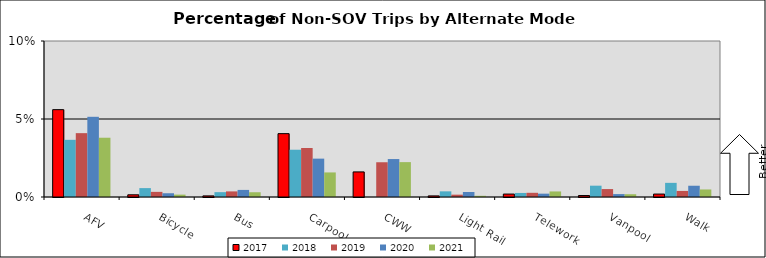
| Category | 2017 | 2018 | 2019 | 2020 | 2021 |
|---|---|---|---|---|---|
| AFV | 0.056 | 0.037 | 0.041 | 0.051 | 0.038 |
| Bicycle | 0.001 | 0.006 | 0.003 | 0.002 | 0.002 |
| Bus | 0.001 | 0.003 | 0.004 | 0.005 | 0.003 |
| Carpool | 0.041 | 0.03 | 0.031 | 0.025 | 0.016 |
| CWW | 0.016 | 0 | 0.022 | 0.024 | 0.022 |
| Light Rail | 0.001 | 0.004 | 0.001 | 0.003 | 0.001 |
| Telework | 0.002 | 0.003 | 0.003 | 0.002 | 0.004 |
| Vanpool | 0.001 | 0.007 | 0.005 | 0.002 | 0.002 |
| Walk | 0.002 | 0.009 | 0.004 | 0.007 | 0.005 |